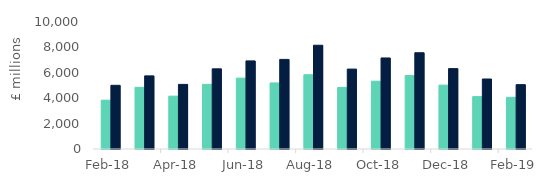
| Category | First-time
buyers | Homemovers |
|---|---|---|
| 2018-02-01 | 3843.988 | 5013.988 |
| 2018-03-01 | 4851.672 | 5757.388 |
| 2018-04-01 | 4162.092 | 5088.238 |
| 2018-05-01 | 5090.5 | 6312.014 |
| 2018-06-01 | 5578.844 | 6938.78 |
| 2018-07-01 | 5199.905 | 7055.526 |
| 2018-08-01 | 5846.172 | 8170.055 |
| 2018-09-01 | 4845.154 | 6292.358 |
| 2018-10-01 | 5337.655 | 7168.223 |
| 2018-11-01 | 5780.404 | 7579.841 |
| 2018-12-01 | 5027.152 | 6329.27 |
| 2019-01-01 | 4125.159 | 5511.384 |
| 2019-02-01 | 4067.501 | 5066.696 |